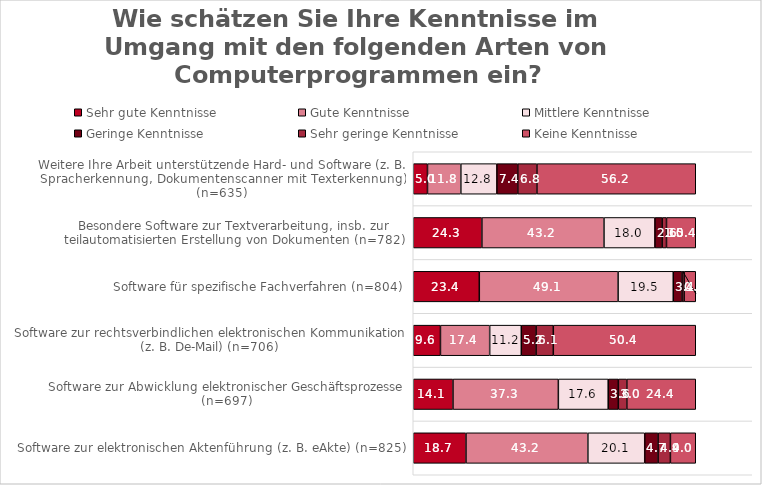
| Category | Sehr gute Kenntnisse | Gute Kenntnisse | Mittlere Kenntnisse | Geringe Kenntnisse | Sehr geringe Kenntnisse | Keine Kenntnisse |
|---|---|---|---|---|---|---|
| Software zur elektronischen Aktenführung (z. B. eAkte) (n=825) | 18.667 | 43.152 | 20.121 | 4.727 | 4.364 | 8.97 |
| Software zur Abwicklung elektronischer Geschäftsprozesse (n=697) | 14.06 | 37.303 | 17.647 | 3.587 | 3.013 | 24.39 |
| Software zur rechtsverbindlichen elektronischen Kommunikation (z. B. De-Mail) (n=706) | 9.632 | 17.422 | 11.19 | 5.241 | 6.091 | 50.425 |
| Software für spezifische Fachverfahren (n=804) | 23.383 | 49.129 | 19.527 | 3.109 | 0.746 | 4.104 |
| Besondere Software zur Textverarbeitung, insb. zur teilautomatisierten Erstellung von Dokumenten (n=782) | 24.297 | 43.223 | 18.031 | 2.558 | 1.535 | 10.358 |
| Weitere Ihre Arbeit unterstützende Hard- und Software (z. B. Spracherkennung, Dokumentenscanner mit Texterkennung) (n=635) | 5.039 | 11.811 | 12.756 | 7.402 | 6.772 | 56.22 |